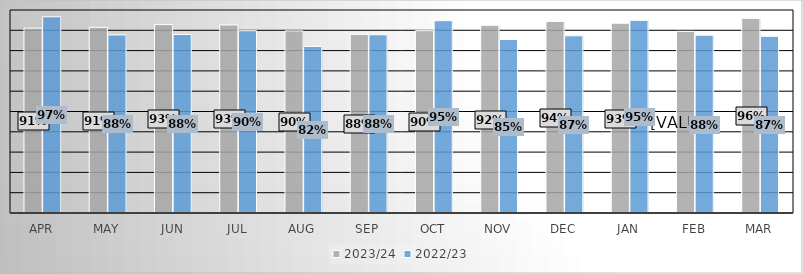
| Category | 2023/24 | 2022/23 |
|---|---|---|
| Apr | 0.911 | 0.967 |
| May | 0.915 | 0.877 |
| Jun | 0.928 | 0.879 |
| Jul | 0.926 | 0.898 |
| Aug | 0.897 | 0.821 |
| Sep | 0.88 | 0.878 |
| Oct | 0.898 | 0.947 |
| Nov | 0.925 | 0.855 |
| Dec | 0.944 | 0.873 |
| Jan | 0.935 | 0.949 |
| Feb | 0.895 | 0.876 |
| Mar | 0.959 | 0.87 |